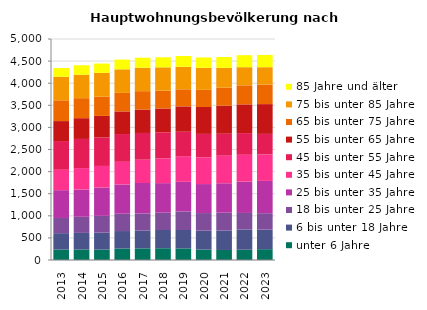
| Category | unter 6 Jahre | 6 bis unter 18 Jahre | 18 bis unter 25 Jahre | 25 bis unter 35 Jahre | 35 bis unter 45 Jahre | 45 bis unter 55 Jahre | 55 bis unter 65 Jahre | 65 bis unter 75 Jahre | 75 bis unter 85 Jahre | 85 Jahre und älter |
|---|---|---|---|---|---|---|---|---|---|---|
| 2013.0 | 236 | 371 | 344 | 629 | 461 | 650 | 452 | 470 | 533 | 197 |
| 2014.0 | 239 | 374 | 365 | 617 | 485 | 659 | 470 | 452 | 533 | 212 |
| 2015.0 | 236 | 383 | 380 | 641 | 488 | 647 | 485 | 434 | 539 | 212 |
| 2016.0 | 260 | 395 | 392 | 662 | 512 | 629 | 512 | 419 | 533 | 221 |
| 2017.0 | 263 | 401 | 389 | 689 | 527 | 605 | 530 | 416 | 530 | 227 |
| 2018.0 | 266 | 413 | 392 | 668 | 560 | 590 | 539 | 404 | 527 | 227 |
| 2019.0 | 263 | 416 | 419 | 671 | 581 | 551 | 575 | 386 | 509 | 245 |
| 2020.0 | 236 | 428 | 398 | 656 | 605 | 530 | 608 | 389 | 497 | 236 |
| 2021.0 | 227 | 440 | 404 | 665 | 623 | 497 | 635 | 407 | 449 | 245 |
| 2022.0 | 233 | 458 | 374 | 710 | 605 | 491 | 650 | 431 | 410 | 272 |
| 2023.0 | 245 | 443 | 371 | 731 | 599 | 464 | 674 | 443 | 392 | 278 |